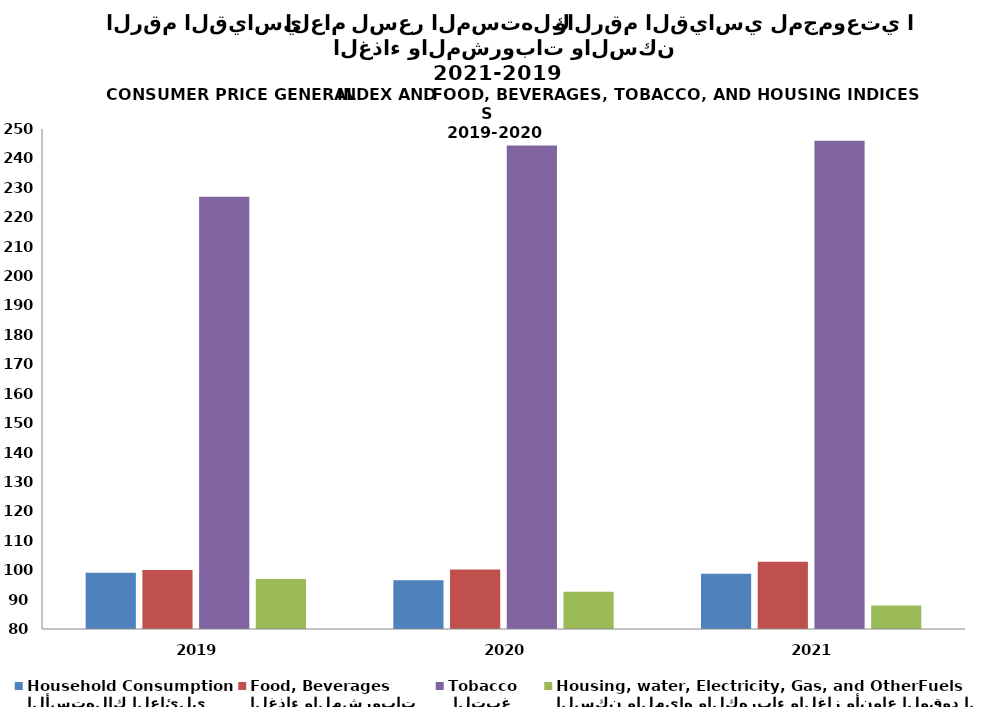
| Category | الأستهلاك العائلي
Household Consumption | الغذاء والمشروبات 
Food, Beverages  |  التبغ
Tobacco | السكن والمياه والكهرباء والغاز وأنواع الوقود الأخرى
Housing, water, Electricity, Gas, and OtherFuels |
|---|---|---|---|---|
| 2019.0 | 99.109 | 100.023 | 227 | 97.025 |
| 2020.0 | 96.549 | 100.222 | 244.417 | 92.665 |
| 2021.0 | 98.777 | 102.902 | 246 | 87.962 |